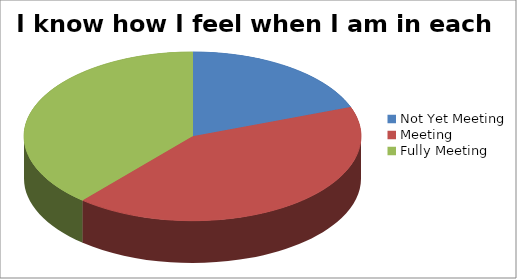
| Category | I know how I feel when I am in each zone |
|---|---|
| Not Yet Meeting | 6 |
| Meeting | 13 |
| Fully Meeting | 12 |